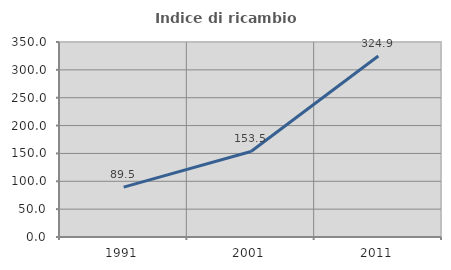
| Category | Indice di ricambio occupazionale  |
|---|---|
| 1991.0 | 89.474 |
| 2001.0 | 153.533 |
| 2011.0 | 324.876 |